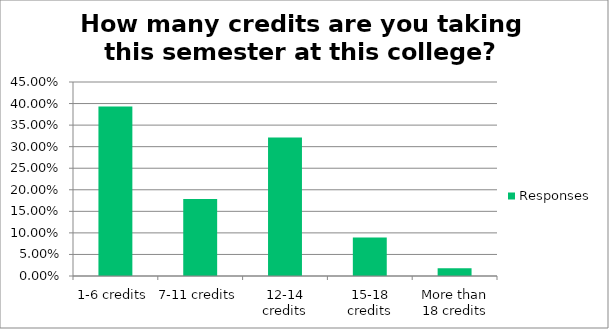
| Category | Responses |
|---|---|
| 1-6 credits | 0.393 |
| 7-11 credits | 0.179 |
| 12-14 credits | 0.321 |
| 15-18 credits | 0.089 |
| More than 18 credits | 0.018 |